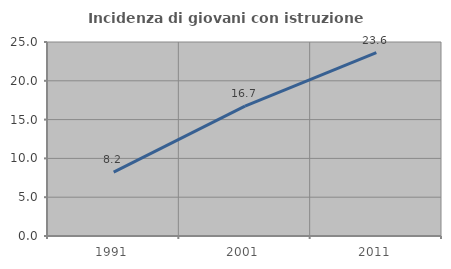
| Category | Incidenza di giovani con istruzione universitaria |
|---|---|
| 1991.0 | 8.223 |
| 2001.0 | 16.735 |
| 2011.0 | 23.632 |